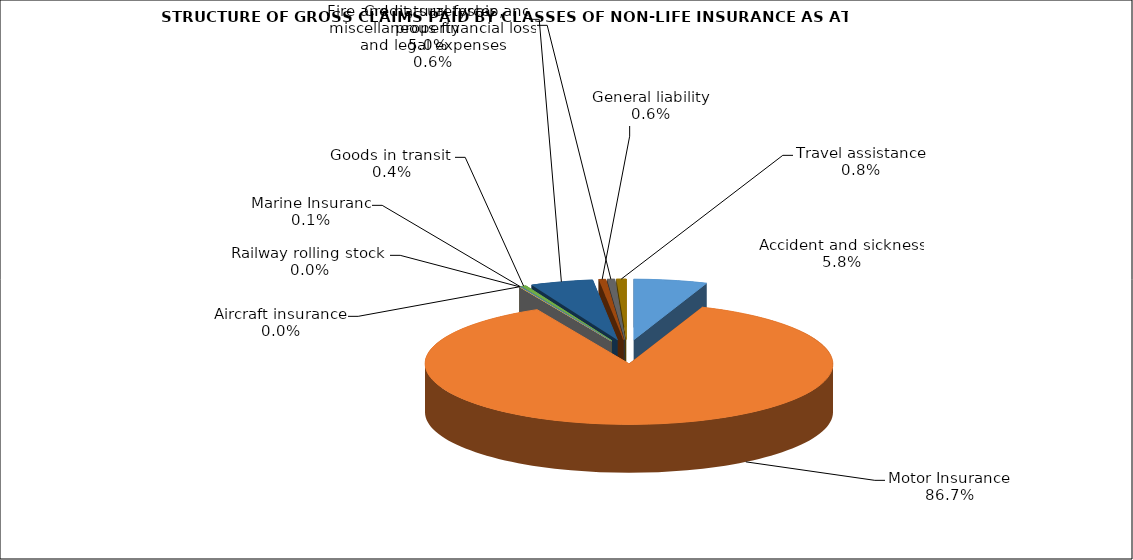
| Category | Accident and sickness | Series 1 |
|---|---|---|
| Accident and sickness | 0.058 |  |
| Motor Insurance | 0.867 |  |
| Railway rolling stock  | 0 |  |
| Aircraft insurance | 0 |  |
| Marine Insuranc | 0.001 |  |
| Goods in transit  | 0.004 |  |
| Fire and natural forces and property | 0.05 |  |
| General liability | 0.006 |  |
| Credit, suretyship, miscellaneous financial loss and legal expenses | 0.006 |  |
| Travel assistance | 0.008 |  |